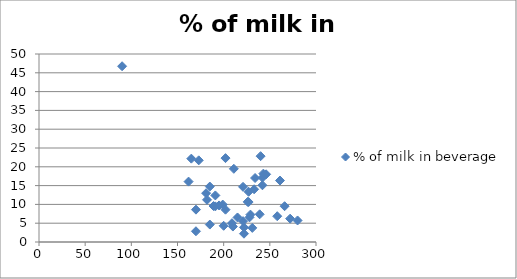
| Category | % of milk in beverage |
|---|---|
| 90.0 | 46.746 |
| 162.0 | 16.062 |
| 165.0 | 22.17 |
| 170.0 | 2.857 |
| 170.0 | 8.602 |
| 173.0 | 21.719 |
| 181.0 | 12.981 |
| 182.0 | 11.22 |
| 185.0 | 4.639 |
| 185.0 | 14.747 |
| 189.0 | 9.569 |
| 191.0 | 9.479 |
| 191.0 | 12.385 |
| 195.0 | 9.722 |
| 199.0 | 9.955 |
| 200.0 | 4.306 |
| 202.0 | 8.597 |
| 202.0 | 22.308 |
| 209.0 | 5 |
| 210.0 | 4.11 |
| 211.0 | 19.466 |
| 215.0 | 6.522 |
| 221.0 | 5.556 |
| 221.0 | 14.672 |
| 222.0 | 3.896 |
| 222.0 | 2.203 |
| 226.0 | 10.672 |
| 227.0 | 10.63 |
| 227.0 | 13.359 |
| 228.0 | 6.557 |
| 229.0 | 7.287 |
| 231.0 | 3.75 |
| 233.0 | 14.022 |
| 234.0 | 17.021 |
| 239.0 | 7.364 |
| 240.0 | 22.83 |
| 242.0 | 15.088 |
| 242.0 | 17.123 |
| 243.0 | 18.182 |
| 246.0 | 18 |
| 258.0 | 6.859 |
| 261.0 | 16.346 |
| 266.0 | 9.524 |
| 272.0 | 6.207 |
| 280.0 | 5.724 |